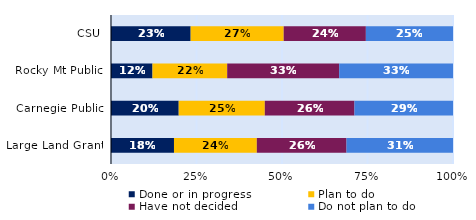
| Category | Done or in progress | Plan to do | Have not decided | Do not plan to do |
|---|---|---|---|---|
| CSU | 0.233 | 0.272 | 0.24 | 0.255 |
| Rocky Mt Public | 0.121 | 0.218 | 0.327 | 0.333 |
| Carnegie Public | 0.198 | 0.252 | 0.262 | 0.288 |
| Large Land Grant | 0.184 | 0.242 | 0.262 | 0.311 |